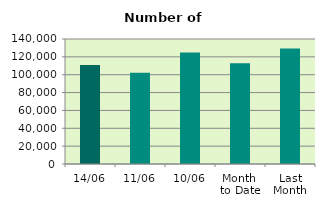
| Category | Series 0 |
|---|---|
| 14/06 | 110822 |
| 11/06 | 102072 |
| 10/06 | 125006 |
| Month 
to Date | 112767.6 |
| Last
Month | 129378.19 |